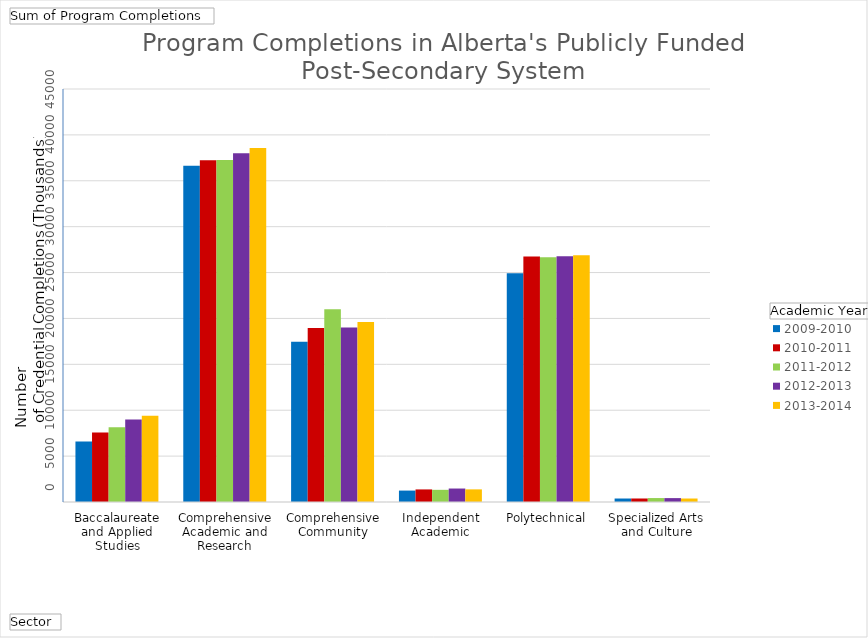
| Category | 2009-2010 | 2010-2011 | 2011-2012 | 2012-2013 | 2013-2014 |
|---|---|---|---|---|---|
| Baccalaureate and Applied Studies | 6590 | 7582 | 8132 | 8982 | 9386 |
| Comprehensive Academic and Research | 36648 | 37240 | 37270 | 38000 | 38572 |
| Comprehensive Community | 17456 | 18968 | 21004 | 19020 | 19600 |
| Independent Academic | 1244 | 1370 | 1326 | 1468 | 1376 |
| Polytechnical | 24916 | 26758 | 26670 | 26766 | 26874 |
| Specialized Arts and Culture | 380 | 382 | 430 | 424 | 380 |